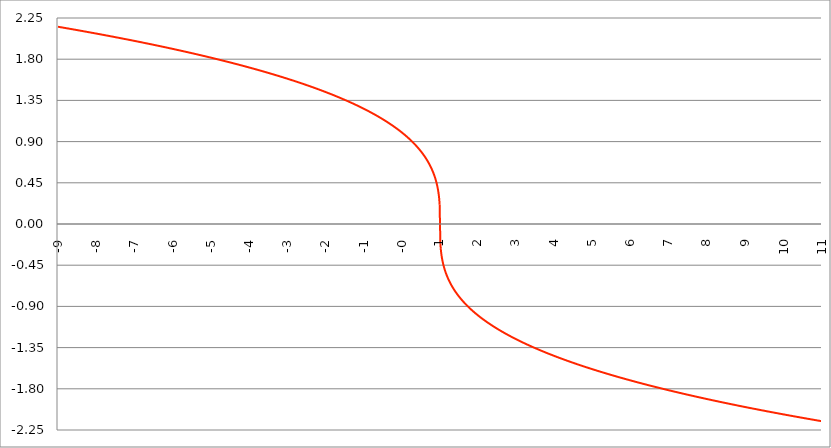
| Category | Series 1 |
|---|---|
| -9.0 | 2.154 |
| -8.99 | 2.154 |
| -8.98 | 2.153 |
| -8.97 | 2.152 |
| -8.96 | 2.152 |
| -8.95 | 2.151 |
| -8.940000000000001 | 2.15 |
| -8.930000000000001 | 2.149 |
| -8.920000000000002 | 2.149 |
| -8.91 | 2.148 |
| -8.900000000000002 | 2.147 |
| -8.890000000000002 | 2.147 |
| -8.880000000000003 | 2.146 |
| -8.870000000000003 | 2.145 |
| -8.860000000000001 | 2.144 |
| -8.850000000000003 | 2.144 |
| -8.840000000000003 | 2.143 |
| -8.830000000000004 | 2.142 |
| -8.820000000000004 | 2.141 |
| -8.810000000000004 | 2.141 |
| -8.800000000000004 | 2.14 |
| -8.790000000000004 | 2.139 |
| -8.780000000000005 | 2.139 |
| -8.770000000000005 | 2.138 |
| -8.760000000000005 | 2.137 |
| -8.750000000000005 | 2.136 |
| -8.740000000000006 | 2.136 |
| -8.730000000000006 | 2.135 |
| -8.720000000000006 | 2.134 |
| -8.710000000000006 | 2.133 |
| -8.700000000000006 | 2.133 |
| -8.690000000000007 | 2.132 |
| -8.680000000000007 | 2.131 |
| -8.670000000000007 | 2.13 |
| -8.660000000000007 | 2.13 |
| -8.650000000000007 | 2.129 |
| -8.640000000000008 | 2.128 |
| -8.630000000000008 | 2.128 |
| -8.620000000000008 | 2.127 |
| -8.610000000000008 | 2.126 |
| -8.600000000000009 | 2.125 |
| -8.590000000000009 | 2.125 |
| -8.580000000000007 | 2.124 |
| -8.57000000000001 | 2.123 |
| -8.56000000000001 | 2.122 |
| -8.55000000000001 | 2.122 |
| -8.54000000000001 | 2.121 |
| -8.53000000000001 | 2.12 |
| -8.52000000000001 | 2.119 |
| -8.51000000000001 | 2.119 |
| -8.50000000000001 | 2.118 |
| -8.49000000000001 | 2.117 |
| -8.48000000000001 | 2.116 |
| -8.47000000000001 | 2.116 |
| -8.46000000000001 | 2.115 |
| -8.45000000000001 | 2.114 |
| -8.44000000000001 | 2.113 |
| -8.430000000000012 | 2.113 |
| -8.420000000000012 | 2.112 |
| -8.410000000000013 | 2.111 |
| -8.400000000000013 | 2.11 |
| -8.390000000000011 | 2.11 |
| -8.380000000000013 | 2.109 |
| -8.370000000000013 | 2.108 |
| -8.360000000000014 | 2.107 |
| -8.350000000000014 | 2.107 |
| -8.340000000000014 | 2.106 |
| -8.330000000000014 | 2.105 |
| -8.320000000000014 | 2.104 |
| -8.310000000000015 | 2.104 |
| -8.300000000000013 | 2.103 |
| -8.290000000000015 | 2.102 |
| -8.280000000000015 | 2.101 |
| -8.270000000000016 | 2.101 |
| -8.260000000000016 | 2.1 |
| -8.250000000000014 | 2.099 |
| -8.240000000000016 | 2.098 |
| -8.230000000000016 | 2.098 |
| -8.220000000000017 | 2.097 |
| -8.210000000000017 | 2.096 |
| -8.200000000000017 | 2.095 |
| -8.190000000000017 | 2.095 |
| -8.180000000000017 | 2.094 |
| -8.170000000000018 | 2.093 |
| -8.160000000000016 | 2.092 |
| -8.150000000000018 | 2.092 |
| -8.140000000000018 | 2.091 |
| -8.130000000000019 | 2.09 |
| -8.120000000000019 | 2.089 |
| -8.110000000000017 | 2.089 |
| -8.10000000000002 | 2.088 |
| -8.09000000000002 | 2.087 |
| -8.08000000000002 | 2.086 |
| -8.07000000000002 | 2.085 |
| -8.06000000000002 | 2.085 |
| -8.05000000000002 | 2.084 |
| -8.04000000000002 | 2.083 |
| -8.03000000000002 | 2.082 |
| -8.020000000000021 | 2.082 |
| -8.010000000000021 | 2.081 |
| -8.000000000000021 | 2.08 |
| -7.990000000000021 | 2.079 |
| -7.980000000000021 | 2.079 |
| -7.970000000000021 | 2.078 |
| -7.960000000000022 | 2.077 |
| -7.950000000000022 | 2.076 |
| -7.940000000000022 | 2.075 |
| -7.930000000000022 | 2.075 |
| -7.920000000000023 | 2.074 |
| -7.910000000000023 | 2.073 |
| -7.900000000000023 | 2.072 |
| -7.890000000000024 | 2.072 |
| -7.880000000000024 | 2.071 |
| -7.870000000000024 | 2.07 |
| -7.860000000000024 | 2.069 |
| -7.850000000000024 | 2.068 |
| -7.840000000000024 | 2.068 |
| -7.830000000000024 | 2.067 |
| -7.820000000000025 | 2.066 |
| -7.810000000000025 | 2.065 |
| -7.800000000000025 | 2.065 |
| -7.790000000000025 | 2.064 |
| -7.780000000000025 | 2.063 |
| -7.770000000000026 | 2.062 |
| -7.760000000000026 | 2.061 |
| -7.750000000000026 | 2.061 |
| -7.740000000000026 | 2.06 |
| -7.730000000000026 | 2.059 |
| -7.720000000000027 | 2.058 |
| -7.710000000000027 | 2.057 |
| -7.700000000000027 | 2.057 |
| -7.690000000000028 | 2.056 |
| -7.680000000000028 | 2.055 |
| -7.670000000000028 | 2.054 |
| -7.660000000000028 | 2.054 |
| -7.650000000000029 | 2.053 |
| -7.640000000000029 | 2.052 |
| -7.63000000000003 | 2.051 |
| -7.620000000000029 | 2.05 |
| -7.61000000000003 | 2.05 |
| -7.60000000000003 | 2.049 |
| -7.59000000000003 | 2.048 |
| -7.58000000000003 | 2.047 |
| -7.57000000000003 | 2.046 |
| -7.560000000000031 | 2.046 |
| -7.550000000000031 | 2.045 |
| -7.540000000000031 | 2.044 |
| -7.530000000000031 | 2.043 |
| -7.520000000000032 | 2.042 |
| -7.510000000000032 | 2.042 |
| -7.500000000000032 | 2.041 |
| -7.490000000000032 | 2.04 |
| -7.480000000000032 | 2.039 |
| -7.470000000000032 | 2.038 |
| -7.460000000000033 | 2.038 |
| -7.450000000000033 | 2.037 |
| -7.440000000000033 | 2.036 |
| -7.430000000000033 | 2.035 |
| -7.420000000000034 | 2.034 |
| -7.410000000000034 | 2.034 |
| -7.400000000000034 | 2.033 |
| -7.390000000000034 | 2.032 |
| -7.380000000000034 | 2.031 |
| -7.370000000000034 | 2.03 |
| -7.360000000000035 | 2.03 |
| -7.350000000000035 | 2.029 |
| -7.340000000000035 | 2.028 |
| -7.330000000000035 | 2.027 |
| -7.320000000000036 | 2.026 |
| -7.310000000000036 | 2.026 |
| -7.300000000000036 | 2.025 |
| -7.290000000000036 | 2.024 |
| -7.280000000000036 | 2.023 |
| -7.270000000000036 | 2.022 |
| -7.260000000000037 | 2.021 |
| -7.250000000000037 | 2.021 |
| -7.240000000000037 | 2.02 |
| -7.230000000000037 | 2.019 |
| -7.220000000000038 | 2.018 |
| -7.210000000000038 | 2.017 |
| -7.200000000000038 | 2.017 |
| -7.190000000000039 | 2.016 |
| -7.180000000000039 | 2.015 |
| -7.170000000000039 | 2.014 |
| -7.160000000000039 | 2.013 |
| -7.150000000000039 | 2.012 |
| -7.14000000000004 | 2.012 |
| -7.13000000000004 | 2.011 |
| -7.12000000000004 | 2.01 |
| -7.11000000000004 | 2.009 |
| -7.10000000000004 | 2.008 |
| -7.090000000000041 | 2.007 |
| -7.080000000000041 | 2.007 |
| -7.070000000000041 | 2.006 |
| -7.060000000000041 | 2.005 |
| -7.050000000000042 | 2.004 |
| -7.040000000000042 | 2.003 |
| -7.030000000000042 | 2.002 |
| -7.020000000000042 | 2.002 |
| -7.010000000000042 | 2.001 |
| -7.000000000000043 | 2 |
| -6.990000000000043 | 1.999 |
| -6.980000000000043 | 1.998 |
| -6.970000000000043 | 1.997 |
| -6.960000000000043 | 1.997 |
| -6.950000000000044 | 1.996 |
| -6.940000000000044 | 1.995 |
| -6.930000000000044 | 1.994 |
| -6.920000000000044 | 1.993 |
| -6.910000000000044 | 1.992 |
| -6.900000000000044 | 1.992 |
| -6.890000000000045 | 1.991 |
| -6.880000000000045 | 1.99 |
| -6.870000000000045 | 1.989 |
| -6.860000000000046 | 1.988 |
| -6.850000000000046 | 1.987 |
| -6.840000000000046 | 1.987 |
| -6.830000000000046 | 1.986 |
| -6.820000000000046 | 1.985 |
| -6.810000000000047 | 1.984 |
| -6.800000000000047 | 1.983 |
| -6.790000000000047 | 1.982 |
| -6.780000000000047 | 1.981 |
| -6.770000000000047 | 1.981 |
| -6.760000000000048 | 1.98 |
| -6.750000000000048 | 1.979 |
| -6.740000000000048 | 1.978 |
| -6.730000000000048 | 1.977 |
| -6.720000000000049 | 1.976 |
| -6.710000000000049 | 1.976 |
| -6.700000000000049 | 1.975 |
| -6.690000000000049 | 1.974 |
| -6.680000000000049 | 1.973 |
| -6.67000000000005 | 1.972 |
| -6.66000000000005 | 1.971 |
| -6.65000000000005 | 1.97 |
| -6.64000000000005 | 1.97 |
| -6.63000000000005 | 1.969 |
| -6.620000000000051 | 1.968 |
| -6.610000000000051 | 1.967 |
| -6.600000000000051 | 1.966 |
| -6.590000000000051 | 1.965 |
| -6.580000000000052 | 1.964 |
| -6.570000000000052 | 1.964 |
| -6.560000000000052 | 1.963 |
| -6.550000000000052 | 1.962 |
| -6.540000000000052 | 1.961 |
| -6.530000000000053 | 1.96 |
| -6.520000000000053 | 1.959 |
| -6.510000000000053 | 1.958 |
| -6.500000000000053 | 1.957 |
| -6.490000000000053 | 1.957 |
| -6.480000000000054 | 1.956 |
| -6.470000000000054 | 1.955 |
| -6.460000000000054 | 1.954 |
| -6.450000000000054 | 1.953 |
| -6.440000000000054 | 1.952 |
| -6.430000000000054 | 1.951 |
| -6.420000000000055 | 1.95 |
| -6.410000000000055 | 1.95 |
| -6.400000000000055 | 1.949 |
| -6.390000000000056 | 1.948 |
| -6.380000000000056 | 1.947 |
| -6.370000000000056 | 1.946 |
| -6.360000000000056 | 1.945 |
| -6.350000000000056 | 1.944 |
| -6.340000000000057 | 1.943 |
| -6.330000000000057 | 1.943 |
| -6.320000000000057 | 1.942 |
| -6.310000000000057 | 1.941 |
| -6.300000000000058 | 1.94 |
| -6.290000000000058 | 1.939 |
| -6.280000000000058 | 1.938 |
| -6.270000000000058 | 1.937 |
| -6.260000000000058 | 1.936 |
| -6.250000000000059 | 1.935 |
| -6.240000000000059 | 1.935 |
| -6.23000000000006 | 1.934 |
| -6.220000000000059 | 1.933 |
| -6.210000000000059 | 1.932 |
| -6.20000000000006 | 1.931 |
| -6.19000000000006 | 1.93 |
| -6.18000000000006 | 1.929 |
| -6.17000000000006 | 1.928 |
| -6.160000000000061 | 1.927 |
| -6.150000000000061 | 1.926 |
| -6.140000000000061 | 1.926 |
| -6.130000000000061 | 1.925 |
| -6.120000000000061 | 1.924 |
| -6.110000000000062 | 1.923 |
| -6.100000000000062 | 1.922 |
| -6.090000000000062 | 1.921 |
| -6.080000000000062 | 1.92 |
| -6.070000000000062 | 1.919 |
| -6.060000000000063 | 1.918 |
| -6.050000000000063 | 1.917 |
| -6.040000000000063 | 1.917 |
| -6.030000000000063 | 1.916 |
| -6.020000000000064 | 1.915 |
| -6.010000000000064 | 1.914 |
| -6.000000000000064 | 1.913 |
| -5.990000000000064 | 1.912 |
| -5.980000000000064 | 1.911 |
| -5.970000000000064 | 1.91 |
| -5.960000000000064 | 1.909 |
| -5.950000000000064 | 1.908 |
| -5.940000000000065 | 1.907 |
| -5.930000000000065 | 1.907 |
| -5.920000000000065 | 1.906 |
| -5.910000000000065 | 1.905 |
| -5.900000000000066 | 1.904 |
| -5.890000000000066 | 1.903 |
| -5.880000000000066 | 1.902 |
| -5.870000000000066 | 1.901 |
| -5.860000000000067 | 1.9 |
| -5.850000000000067 | 1.899 |
| -5.840000000000067 | 1.898 |
| -5.830000000000067 | 1.897 |
| -5.820000000000068 | 1.896 |
| -5.810000000000068 | 1.895 |
| -5.800000000000068 | 1.895 |
| -5.790000000000068 | 1.894 |
| -5.780000000000068 | 1.893 |
| -5.770000000000068 | 1.892 |
| -5.760000000000069 | 1.891 |
| -5.75000000000007 | 1.89 |
| -5.74000000000007 | 1.889 |
| -5.73000000000007 | 1.888 |
| -5.72000000000007 | 1.887 |
| -5.71000000000007 | 1.886 |
| -5.70000000000007 | 1.885 |
| -5.69000000000007 | 1.884 |
| -5.680000000000071 | 1.883 |
| -5.670000000000071 | 1.882 |
| -5.660000000000071 | 1.881 |
| -5.650000000000071 | 1.881 |
| -5.640000000000072 | 1.88 |
| -5.630000000000072 | 1.879 |
| -5.620000000000072 | 1.878 |
| -5.610000000000072 | 1.877 |
| -5.600000000000072 | 1.876 |
| -5.590000000000073 | 1.875 |
| -5.580000000000073 | 1.874 |
| -5.570000000000073 | 1.873 |
| -5.560000000000073 | 1.872 |
| -5.550000000000074 | 1.871 |
| -5.540000000000074 | 1.87 |
| -5.530000000000074 | 1.869 |
| -5.520000000000074 | 1.868 |
| -5.510000000000074 | 1.867 |
| -5.500000000000074 | 1.866 |
| -5.490000000000074 | 1.865 |
| -5.480000000000074 | 1.864 |
| -5.470000000000075 | 1.863 |
| -5.460000000000075 | 1.862 |
| -5.450000000000075 | 1.861 |
| -5.440000000000075 | 1.86 |
| -5.430000000000076 | 1.86 |
| -5.420000000000076 | 1.859 |
| -5.410000000000076 | 1.858 |
| -5.400000000000076 | 1.857 |
| -5.390000000000077 | 1.856 |
| -5.380000000000077 | 1.855 |
| -5.370000000000077 | 1.854 |
| -5.360000000000078 | 1.853 |
| -5.350000000000078 | 1.852 |
| -5.340000000000078 | 1.851 |
| -5.330000000000078 | 1.85 |
| -5.320000000000078 | 1.849 |
| -5.310000000000079 | 1.848 |
| -5.300000000000079 | 1.847 |
| -5.29000000000008 | 1.846 |
| -5.28000000000008 | 1.845 |
| -5.27000000000008 | 1.844 |
| -5.26000000000008 | 1.843 |
| -5.25000000000008 | 1.842 |
| -5.24000000000008 | 1.841 |
| -5.23000000000008 | 1.84 |
| -5.220000000000081 | 1.839 |
| -5.210000000000081 | 1.838 |
| -5.200000000000081 | 1.837 |
| -5.190000000000081 | 1.836 |
| -5.180000000000081 | 1.835 |
| -5.170000000000082 | 1.834 |
| -5.160000000000082 | 1.833 |
| -5.150000000000082 | 1.832 |
| -5.140000000000082 | 1.831 |
| -5.130000000000082 | 1.83 |
| -5.120000000000083 | 1.829 |
| -5.110000000000083 | 1.828 |
| -5.100000000000083 | 1.827 |
| -5.090000000000083 | 1.826 |
| -5.080000000000084 | 1.825 |
| -5.070000000000084 | 1.824 |
| -5.060000000000084 | 1.823 |
| -5.050000000000084 | 1.822 |
| -5.040000000000084 | 1.821 |
| -5.030000000000084 | 1.82 |
| -5.020000000000085 | 1.819 |
| -5.010000000000085 | 1.818 |
| -5.000000000000085 | 1.817 |
| -4.990000000000085 | 1.816 |
| -4.980000000000085 | 1.815 |
| -4.970000000000085 | 1.814 |
| -4.960000000000086 | 1.813 |
| -4.950000000000086 | 1.812 |
| -4.940000000000086 | 1.811 |
| -4.930000000000086 | 1.81 |
| -4.920000000000087 | 1.809 |
| -4.910000000000087 | 1.808 |
| -4.900000000000087 | 1.807 |
| -4.890000000000088 | 1.806 |
| -4.880000000000088 | 1.805 |
| -4.870000000000088 | 1.804 |
| -4.860000000000088 | 1.803 |
| -4.850000000000088 | 1.802 |
| -4.840000000000089 | 1.801 |
| -4.830000000000089 | 1.8 |
| -4.820000000000089 | 1.799 |
| -4.810000000000089 | 1.798 |
| -4.800000000000089 | 1.797 |
| -4.79000000000009 | 1.796 |
| -4.78000000000009 | 1.795 |
| -4.77000000000009 | 1.794 |
| -4.76000000000009 | 1.793 |
| -4.750000000000091 | 1.792 |
| -4.740000000000091 | 1.79 |
| -4.730000000000091 | 1.789 |
| -4.720000000000091 | 1.788 |
| -4.710000000000091 | 1.787 |
| -4.700000000000092 | 1.786 |
| -4.690000000000092 | 1.785 |
| -4.680000000000092 | 1.784 |
| -4.670000000000092 | 1.783 |
| -4.660000000000092 | 1.782 |
| -4.650000000000093 | 1.781 |
| -4.640000000000093 | 1.78 |
| -4.630000000000093 | 1.779 |
| -4.620000000000093 | 1.778 |
| -4.610000000000093 | 1.777 |
| -4.600000000000094 | 1.776 |
| -4.590000000000094 | 1.775 |
| -4.580000000000094 | 1.774 |
| -4.570000000000094 | 1.773 |
| -4.560000000000095 | 1.772 |
| -4.550000000000095 | 1.771 |
| -4.540000000000095 | 1.769 |
| -4.530000000000095 | 1.768 |
| -4.520000000000095 | 1.767 |
| -4.510000000000096 | 1.766 |
| -4.500000000000096 | 1.765 |
| -4.490000000000096 | 1.764 |
| -4.480000000000096 | 1.763 |
| -4.470000000000096 | 1.762 |
| -4.460000000000097 | 1.761 |
| -4.450000000000097 | 1.76 |
| -4.440000000000097 | 1.759 |
| -4.430000000000097 | 1.758 |
| -4.420000000000098 | 1.757 |
| -4.410000000000098 | 1.755 |
| -4.400000000000098 | 1.754 |
| -4.390000000000098 | 1.753 |
| -4.380000000000098 | 1.752 |
| -4.370000000000099 | 1.751 |
| -4.360000000000099 | 1.75 |
| -4.350000000000099 | 1.749 |
| -4.340000000000099 | 1.748 |
| -4.330000000000099 | 1.747 |
| -4.3200000000001 | 1.746 |
| -4.3100000000001 | 1.745 |
| -4.3000000000001 | 1.744 |
| -4.2900000000001 | 1.742 |
| -4.2800000000001 | 1.741 |
| -4.2700000000001 | 1.74 |
| -4.260000000000101 | 1.739 |
| -4.250000000000101 | 1.738 |
| -4.240000000000101 | 1.737 |
| -4.230000000000101 | 1.736 |
| -4.220000000000102 | 1.735 |
| -4.210000000000102 | 1.734 |
| -4.200000000000102 | 1.732 |
| -4.190000000000103 | 1.731 |
| -4.180000000000103 | 1.73 |
| -4.170000000000103 | 1.729 |
| -4.160000000000103 | 1.728 |
| -4.150000000000103 | 1.727 |
| -4.140000000000104 | 1.726 |
| -4.130000000000104 | 1.725 |
| -4.120000000000104 | 1.724 |
| -4.110000000000104 | 1.722 |
| -4.100000000000104 | 1.721 |
| -4.090000000000104 | 1.72 |
| -4.080000000000104 | 1.719 |
| -4.070000000000105 | 1.718 |
| -4.060000000000105 | 1.717 |
| -4.050000000000105 | 1.716 |
| -4.040000000000105 | 1.715 |
| -4.030000000000105 | 1.713 |
| -4.020000000000106 | 1.712 |
| -4.010000000000106 | 1.711 |
| -4.000000000000106 | 1.71 |
| -3.990000000000107 | 1.709 |
| -3.980000000000107 | 1.708 |
| -3.970000000000107 | 1.707 |
| -3.960000000000107 | 1.705 |
| -3.950000000000108 | 1.704 |
| -3.940000000000108 | 1.703 |
| -3.930000000000108 | 1.702 |
| -3.920000000000108 | 1.701 |
| -3.910000000000108 | 1.7 |
| -3.900000000000109 | 1.698 |
| -3.890000000000109 | 1.697 |
| -3.880000000000109 | 1.696 |
| -3.870000000000109 | 1.695 |
| -3.86000000000011 | 1.694 |
| -3.85000000000011 | 1.693 |
| -3.84000000000011 | 1.692 |
| -3.83000000000011 | 1.69 |
| -3.82000000000011 | 1.689 |
| -3.810000000000111 | 1.688 |
| -3.800000000000111 | 1.687 |
| -3.790000000000111 | 1.686 |
| -3.780000000000111 | 1.685 |
| -3.770000000000111 | 1.683 |
| -3.760000000000112 | 1.682 |
| -3.750000000000112 | 1.681 |
| -3.740000000000112 | 1.68 |
| -3.730000000000112 | 1.679 |
| -3.720000000000112 | 1.677 |
| -3.710000000000113 | 1.676 |
| -3.700000000000113 | 1.675 |
| -3.690000000000113 | 1.674 |
| -3.680000000000113 | 1.673 |
| -3.670000000000114 | 1.671 |
| -3.660000000000114 | 1.67 |
| -3.650000000000114 | 1.669 |
| -3.640000000000114 | 1.668 |
| -3.630000000000114 | 1.667 |
| -3.620000000000115 | 1.666 |
| -3.610000000000115 | 1.664 |
| -3.600000000000115 | 1.663 |
| -3.590000000000115 | 1.662 |
| -3.580000000000116 | 1.661 |
| -3.570000000000116 | 1.659 |
| -3.560000000000116 | 1.658 |
| -3.550000000000116 | 1.657 |
| -3.540000000000116 | 1.656 |
| -3.530000000000117 | 1.655 |
| -3.520000000000117 | 1.653 |
| -3.510000000000117 | 1.652 |
| -3.500000000000117 | 1.651 |
| -3.490000000000117 | 1.65 |
| -3.480000000000118 | 1.649 |
| -3.470000000000118 | 1.647 |
| -3.460000000000118 | 1.646 |
| -3.450000000000118 | 1.645 |
| -3.440000000000118 | 1.644 |
| -3.430000000000119 | 1.642 |
| -3.420000000000119 | 1.641 |
| -3.410000000000119 | 1.64 |
| -3.400000000000119 | 1.639 |
| -3.39000000000012 | 1.637 |
| -3.38000000000012 | 1.636 |
| -3.37000000000012 | 1.635 |
| -3.36000000000012 | 1.634 |
| -3.35000000000012 | 1.632 |
| -3.340000000000121 | 1.631 |
| -3.330000000000121 | 1.63 |
| -3.320000000000121 | 1.629 |
| -3.310000000000121 | 1.627 |
| -3.300000000000121 | 1.626 |
| -3.290000000000122 | 1.625 |
| -3.280000000000122 | 1.624 |
| -3.270000000000122 | 1.622 |
| -3.260000000000122 | 1.621 |
| -3.250000000000123 | 1.62 |
| -3.240000000000123 | 1.619 |
| -3.230000000000123 | 1.617 |
| -3.220000000000123 | 1.616 |
| -3.210000000000123 | 1.615 |
| -3.200000000000124 | 1.613 |
| -3.190000000000124 | 1.612 |
| -3.180000000000124 | 1.611 |
| -3.170000000000124 | 1.61 |
| -3.160000000000124 | 1.608 |
| -3.150000000000125 | 1.607 |
| -3.140000000000125 | 1.606 |
| -3.130000000000125 | 1.604 |
| -3.120000000000125 | 1.603 |
| -3.110000000000126 | 1.602 |
| -3.100000000000126 | 1.601 |
| -3.090000000000126 | 1.599 |
| -3.080000000000126 | 1.598 |
| -3.070000000000126 | 1.597 |
| -3.060000000000127 | 1.595 |
| -3.050000000000127 | 1.594 |
| -3.040000000000127 | 1.593 |
| -3.030000000000127 | 1.591 |
| -3.020000000000127 | 1.59 |
| -3.010000000000128 | 1.589 |
| -3.000000000000128 | 1.587 |
| -2.990000000000128 | 1.586 |
| -2.980000000000128 | 1.585 |
| -2.970000000000129 | 1.583 |
| -2.960000000000129 | 1.582 |
| -2.950000000000129 | 1.581 |
| -2.940000000000129 | 1.579 |
| -2.930000000000129 | 1.578 |
| -2.92000000000013 | 1.577 |
| -2.91000000000013 | 1.575 |
| -2.90000000000013 | 1.574 |
| -2.89000000000013 | 1.573 |
| -2.88000000000013 | 1.571 |
| -2.870000000000131 | 1.57 |
| -2.860000000000131 | 1.569 |
| -2.850000000000131 | 1.567 |
| -2.840000000000131 | 1.566 |
| -2.830000000000131 | 1.565 |
| -2.820000000000132 | 1.563 |
| -2.810000000000132 | 1.562 |
| -2.800000000000132 | 1.56 |
| -2.790000000000132 | 1.559 |
| -2.780000000000132 | 1.558 |
| -2.770000000000133 | 1.556 |
| -2.760000000000133 | 1.555 |
| -2.750000000000133 | 1.554 |
| -2.740000000000133 | 1.552 |
| -2.730000000000134 | 1.551 |
| -2.720000000000134 | 1.549 |
| -2.710000000000134 | 1.548 |
| -2.700000000000134 | 1.547 |
| -2.690000000000134 | 1.545 |
| -2.680000000000135 | 1.544 |
| -2.670000000000135 | 1.542 |
| -2.660000000000135 | 1.541 |
| -2.650000000000135 | 1.54 |
| -2.640000000000135 | 1.538 |
| -2.630000000000136 | 1.537 |
| -2.620000000000136 | 1.535 |
| -2.610000000000136 | 1.534 |
| -2.600000000000136 | 1.533 |
| -2.590000000000137 | 1.531 |
| -2.580000000000137 | 1.53 |
| -2.570000000000137 | 1.528 |
| -2.560000000000137 | 1.527 |
| -2.550000000000137 | 1.525 |
| -2.540000000000138 | 1.524 |
| -2.530000000000138 | 1.523 |
| -2.520000000000138 | 1.521 |
| -2.510000000000138 | 1.52 |
| -2.500000000000139 | 1.518 |
| -2.490000000000139 | 1.517 |
| -2.480000000000139 | 1.515 |
| -2.470000000000139 | 1.514 |
| -2.460000000000139 | 1.512 |
| -2.45000000000014 | 1.511 |
| -2.44000000000014 | 1.51 |
| -2.43000000000014 | 1.508 |
| -2.42000000000014 | 1.507 |
| -2.41000000000014 | 1.505 |
| -2.400000000000141 | 1.504 |
| -2.390000000000141 | 1.502 |
| -2.380000000000141 | 1.501 |
| -2.370000000000141 | 1.499 |
| -2.360000000000141 | 1.498 |
| -2.350000000000142 | 1.496 |
| -2.340000000000142 | 1.495 |
| -2.330000000000142 | 1.493 |
| -2.320000000000142 | 1.492 |
| -2.310000000000143 | 1.49 |
| -2.300000000000143 | 1.489 |
| -2.290000000000143 | 1.487 |
| -2.280000000000143 | 1.486 |
| -2.270000000000143 | 1.484 |
| -2.260000000000144 | 1.483 |
| -2.250000000000144 | 1.481 |
| -2.240000000000144 | 1.48 |
| -2.230000000000144 | 1.478 |
| -2.220000000000145 | 1.477 |
| -2.210000000000145 | 1.475 |
| -2.200000000000145 | 1.474 |
| -2.190000000000145 | 1.472 |
| -2.180000000000145 | 1.471 |
| -2.170000000000146 | 1.469 |
| -2.160000000000146 | 1.467 |
| -2.150000000000146 | 1.466 |
| -2.140000000000146 | 1.464 |
| -2.130000000000146 | 1.463 |
| -2.120000000000147 | 1.461 |
| -2.110000000000147 | 1.46 |
| -2.100000000000147 | 1.458 |
| -2.090000000000147 | 1.457 |
| -2.080000000000147 | 1.455 |
| -2.070000000000148 | 1.453 |
| -2.060000000000148 | 1.452 |
| -2.050000000000148 | 1.45 |
| -2.040000000000148 | 1.449 |
| -2.030000000000149 | 1.447 |
| -2.020000000000149 | 1.445 |
| -2.010000000000149 | 1.444 |
| -2.000000000000149 | 1.442 |
| -1.990000000000149 | 1.441 |
| -1.980000000000149 | 1.439 |
| -1.970000000000149 | 1.437 |
| -1.960000000000149 | 1.436 |
| -1.950000000000149 | 1.434 |
| -1.940000000000149 | 1.433 |
| -1.930000000000149 | 1.431 |
| -1.920000000000149 | 1.429 |
| -1.910000000000149 | 1.428 |
| -1.900000000000149 | 1.426 |
| -1.89000000000015 | 1.424 |
| -1.88000000000015 | 1.423 |
| -1.87000000000015 | 1.421 |
| -1.86000000000015 | 1.419 |
| -1.85000000000015 | 1.418 |
| -1.84000000000015 | 1.416 |
| -1.83000000000015 | 1.414 |
| -1.82000000000015 | 1.413 |
| -1.810000000000149 | 1.411 |
| -1.800000000000149 | 1.409 |
| -1.790000000000149 | 1.408 |
| -1.780000000000149 | 1.406 |
| -1.770000000000149 | 1.404 |
| -1.760000000000149 | 1.403 |
| -1.750000000000149 | 1.401 |
| -1.740000000000149 | 1.399 |
| -1.730000000000149 | 1.398 |
| -1.720000000000149 | 1.396 |
| -1.710000000000149 | 1.394 |
| -1.700000000000149 | 1.392 |
| -1.690000000000149 | 1.391 |
| -1.680000000000149 | 1.389 |
| -1.670000000000149 | 1.387 |
| -1.660000000000149 | 1.386 |
| -1.650000000000149 | 1.384 |
| -1.640000000000149 | 1.382 |
| -1.630000000000149 | 1.38 |
| -1.620000000000149 | 1.379 |
| -1.610000000000149 | 1.377 |
| -1.600000000000149 | 1.375 |
| -1.590000000000149 | 1.373 |
| -1.580000000000149 | 1.372 |
| -1.570000000000149 | 1.37 |
| -1.560000000000149 | 1.368 |
| -1.550000000000149 | 1.366 |
| -1.540000000000149 | 1.364 |
| -1.530000000000149 | 1.363 |
| -1.520000000000149 | 1.361 |
| -1.510000000000149 | 1.359 |
| -1.500000000000149 | 1.357 |
| -1.490000000000149 | 1.355 |
| -1.480000000000149 | 1.354 |
| -1.470000000000149 | 1.352 |
| -1.460000000000149 | 1.35 |
| -1.450000000000149 | 1.348 |
| -1.440000000000149 | 1.346 |
| -1.430000000000149 | 1.344 |
| -1.420000000000149 | 1.343 |
| -1.410000000000149 | 1.341 |
| -1.400000000000149 | 1.339 |
| -1.390000000000149 | 1.337 |
| -1.380000000000149 | 1.335 |
| -1.370000000000149 | 1.333 |
| -1.360000000000149 | 1.331 |
| -1.350000000000149 | 1.33 |
| -1.340000000000149 | 1.328 |
| -1.330000000000149 | 1.326 |
| -1.320000000000149 | 1.324 |
| -1.310000000000149 | 1.322 |
| -1.300000000000149 | 1.32 |
| -1.290000000000149 | 1.318 |
| -1.280000000000149 | 1.316 |
| -1.270000000000149 | 1.314 |
| -1.260000000000149 | 1.312 |
| -1.250000000000149 | 1.31 |
| -1.240000000000149 | 1.308 |
| -1.230000000000149 | 1.306 |
| -1.220000000000149 | 1.305 |
| -1.210000000000148 | 1.303 |
| -1.200000000000148 | 1.301 |
| -1.190000000000148 | 1.299 |
| -1.180000000000148 | 1.297 |
| -1.170000000000148 | 1.295 |
| -1.160000000000148 | 1.293 |
| -1.150000000000148 | 1.291 |
| -1.140000000000148 | 1.289 |
| -1.130000000000148 | 1.287 |
| -1.120000000000148 | 1.285 |
| -1.110000000000148 | 1.283 |
| -1.100000000000148 | 1.281 |
| -1.090000000000148 | 1.279 |
| -1.080000000000148 | 1.277 |
| -1.070000000000148 | 1.274 |
| -1.060000000000148 | 1.272 |
| -1.050000000000148 | 1.27 |
| -1.040000000000148 | 1.268 |
| -1.030000000000148 | 1.266 |
| -1.020000000000148 | 1.264 |
| -1.010000000000148 | 1.262 |
| -1.000000000000148 | 1.26 |
| -0.990000000000148 | 1.258 |
| -0.980000000000148 | 1.256 |
| -0.970000000000148 | 1.254 |
| -0.960000000000148 | 1.251 |
| -0.950000000000148 | 1.249 |
| -0.940000000000148 | 1.247 |
| -0.930000000000148 | 1.245 |
| -0.920000000000148 | 1.243 |
| -0.910000000000148 | 1.241 |
| -0.900000000000148 | 1.239 |
| -0.890000000000148 | 1.236 |
| -0.880000000000148 | 1.234 |
| -0.870000000000148 | 1.232 |
| -0.860000000000148 | 1.23 |
| -0.850000000000148 | 1.228 |
| -0.840000000000148 | 1.225 |
| -0.830000000000148 | 1.223 |
| -0.820000000000148 | 1.221 |
| -0.810000000000148 | 1.219 |
| -0.800000000000148 | 1.216 |
| -0.790000000000148 | 1.214 |
| -0.780000000000148 | 1.212 |
| -0.770000000000148 | 1.21 |
| -0.760000000000148 | 1.207 |
| -0.750000000000148 | 1.205 |
| -0.740000000000148 | 1.203 |
| -0.730000000000148 | 1.2 |
| -0.720000000000148 | 1.198 |
| -0.710000000000148 | 1.196 |
| -0.700000000000148 | 1.193 |
| -0.690000000000148 | 1.191 |
| -0.680000000000148 | 1.189 |
| -0.670000000000148 | 1.186 |
| -0.660000000000148 | 1.184 |
| -0.650000000000148 | 1.182 |
| -0.640000000000148 | 1.179 |
| -0.630000000000148 | 1.177 |
| -0.620000000000148 | 1.174 |
| -0.610000000000148 | 1.172 |
| -0.600000000000148 | 1.17 |
| -0.590000000000148 | 1.167 |
| -0.580000000000148 | 1.165 |
| -0.570000000000148 | 1.162 |
| -0.560000000000148 | 1.16 |
| -0.550000000000148 | 1.157 |
| -0.540000000000148 | 1.155 |
| -0.530000000000148 | 1.152 |
| -0.520000000000148 | 1.15 |
| -0.510000000000148 | 1.147 |
| -0.500000000000148 | 1.145 |
| -0.490000000000148 | 1.142 |
| -0.480000000000148 | 1.14 |
| -0.470000000000148 | 1.137 |
| -0.460000000000148 | 1.134 |
| -0.450000000000148 | 1.132 |
| -0.440000000000148 | 1.129 |
| -0.430000000000148 | 1.127 |
| -0.420000000000148 | 1.124 |
| -0.410000000000148 | 1.121 |
| -0.400000000000148 | 1.119 |
| -0.390000000000148 | 1.116 |
| -0.380000000000148 | 1.113 |
| -0.370000000000148 | 1.111 |
| -0.360000000000148 | 1.108 |
| -0.350000000000148 | 1.105 |
| -0.340000000000148 | 1.102 |
| -0.330000000000148 | 1.1 |
| -0.320000000000148 | 1.097 |
| -0.310000000000148 | 1.094 |
| -0.300000000000148 | 1.091 |
| -0.290000000000148 | 1.089 |
| -0.280000000000148 | 1.086 |
| -0.270000000000148 | 1.083 |
| -0.260000000000148 | 1.08 |
| -0.250000000000148 | 1.077 |
| -0.240000000000148 | 1.074 |
| -0.230000000000148 | 1.071 |
| -0.220000000000148 | 1.069 |
| -0.210000000000148 | 1.066 |
| -0.200000000000148 | 1.063 |
| -0.190000000000148 | 1.06 |
| -0.180000000000148 | 1.057 |
| -0.170000000000148 | 1.054 |
| -0.160000000000148 | 1.051 |
| -0.150000000000148 | 1.048 |
| -0.140000000000148 | 1.045 |
| -0.130000000000148 | 1.042 |
| -0.120000000000148 | 1.038 |
| -0.110000000000148 | 1.035 |
| -0.100000000000148 | 1.032 |
| -0.0900000000001475 | 1.029 |
| -0.0800000000001476 | 1.026 |
| -0.0700000000001476 | 1.023 |
| -0.0600000000001476 | 1.02 |
| -0.0500000000001476 | 1.016 |
| -0.0400000000001476 | 1.013 |
| -0.0300000000001476 | 1.01 |
| -0.0200000000001476 | 1.007 |
| -0.0100000000001476 | 1.003 |
| -1.47572926101347e-13 | 1 |
| 0.00999999999985242 | 0.997 |
| 0.0199999999998524 | 0.993 |
| 0.0299999999998524 | 0.99 |
| 0.0399999999998524 | 0.986 |
| 0.0499999999998524 | 0.983 |
| 0.0599999999998524 | 0.98 |
| 0.0699999999998524 | 0.976 |
| 0.0799999999998524 | 0.973 |
| 0.0899999999998524 | 0.969 |
| 0.0999999999998524 | 0.965 |
| 0.109999999999852 | 0.962 |
| 0.119999999999852 | 0.958 |
| 0.129999999999852 | 0.955 |
| 0.139999999999852 | 0.951 |
| 0.149999999999852 | 0.947 |
| 0.159999999999852 | 0.944 |
| 0.169999999999852 | 0.94 |
| 0.179999999999852 | 0.936 |
| 0.189999999999852 | 0.932 |
| 0.199999999999852 | 0.928 |
| 0.209999999999852 | 0.924 |
| 0.219999999999852 | 0.921 |
| 0.229999999999852 | 0.917 |
| 0.239999999999852 | 0.913 |
| 0.249999999999852 | 0.909 |
| 0.259999999999852 | 0.905 |
| 0.269999999999852 | 0.9 |
| 0.279999999999853 | 0.896 |
| 0.289999999999853 | 0.892 |
| 0.299999999999853 | 0.888 |
| 0.309999999999853 | 0.884 |
| 0.319999999999853 | 0.879 |
| 0.329999999999853 | 0.875 |
| 0.339999999999853 | 0.871 |
| 0.349999999999853 | 0.866 |
| 0.359999999999853 | 0.862 |
| 0.369999999999853 | 0.857 |
| 0.379999999999853 | 0.853 |
| 0.389999999999853 | 0.848 |
| 0.399999999999853 | 0.843 |
| 0.409999999999853 | 0.839 |
| 0.419999999999853 | 0.834 |
| 0.429999999999853 | 0.829 |
| 0.439999999999853 | 0.824 |
| 0.449999999999853 | 0.819 |
| 0.459999999999853 | 0.814 |
| 0.469999999999853 | 0.809 |
| 0.479999999999853 | 0.804 |
| 0.489999999999853 | 0.799 |
| 0.499999999999853 | 0.794 |
| 0.509999999999853 | 0.788 |
| 0.519999999999853 | 0.783 |
| 0.529999999999853 | 0.777 |
| 0.539999999999853 | 0.772 |
| 0.549999999999853 | 0.766 |
| 0.559999999999853 | 0.761 |
| 0.569999999999853 | 0.755 |
| 0.579999999999853 | 0.749 |
| 0.589999999999853 | 0.743 |
| 0.599999999999853 | 0.737 |
| 0.609999999999853 | 0.731 |
| 0.619999999999853 | 0.724 |
| 0.629999999999853 | 0.718 |
| 0.639999999999853 | 0.711 |
| 0.649999999999853 | 0.705 |
| 0.659999999999853 | 0.698 |
| 0.669999999999853 | 0.691 |
| 0.679999999999853 | 0.684 |
| 0.689999999999853 | 0.677 |
| 0.699999999999853 | 0.669 |
| 0.709999999999853 | 0.662 |
| 0.719999999999853 | 0.654 |
| 0.729999999999853 | 0.646 |
| 0.739999999999853 | 0.638 |
| 0.749999999999853 | 0.63 |
| 0.759999999999853 | 0.621 |
| 0.769999999999853 | 0.613 |
| 0.779999999999853 | 0.604 |
| 0.789999999999853 | 0.594 |
| 0.799999999999853 | 0.585 |
| 0.809999999999853 | 0.575 |
| 0.819999999999853 | 0.565 |
| 0.829999999999853 | 0.554 |
| 0.839999999999853 | 0.543 |
| 0.849999999999853 | 0.531 |
| 0.859999999999853 | 0.519 |
| 0.869999999999853 | 0.507 |
| 0.879999999999853 | 0.493 |
| 0.889999999999853 | 0.479 |
| 0.899999999999853 | 0.464 |
| 0.909999999999853 | 0.448 |
| 0.919999999999853 | 0.431 |
| 0.929999999999853 | 0.412 |
| 0.939999999999853 | 0.391 |
| 0.949999999999853 | 0.368 |
| 0.959999999999853 | 0.342 |
| 0.969999999999853 | 0.311 |
| 0.979999999999853 | 0.271 |
| 0.989999999999853 | 0.215 |
| 0.999999999999853 | 0 |
| 1.009999999999853 | -0.215 |
| 1.019999999999853 | -0.271 |
| 1.029999999999853 | -0.311 |
| 1.039999999999853 | -0.342 |
| 1.049999999999853 | -0.368 |
| 1.059999999999853 | -0.391 |
| 1.069999999999853 | -0.412 |
| 1.079999999999853 | -0.431 |
| 1.089999999999853 | -0.448 |
| 1.099999999999853 | -0.464 |
| 1.109999999999853 | -0.479 |
| 1.119999999999853 | -0.493 |
| 1.129999999999853 | -0.507 |
| 1.139999999999853 | -0.519 |
| 1.149999999999853 | -0.531 |
| 1.159999999999853 | -0.543 |
| 1.169999999999853 | -0.554 |
| 1.179999999999853 | -0.565 |
| 1.189999999999853 | -0.575 |
| 1.199999999999853 | -0.585 |
| 1.209999999999853 | -0.594 |
| 1.219999999999853 | -0.604 |
| 1.229999999999853 | -0.613 |
| 1.239999999999853 | -0.621 |
| 1.249999999999853 | -0.63 |
| 1.259999999999853 | -0.638 |
| 1.269999999999853 | -0.646 |
| 1.279999999999853 | -0.654 |
| 1.289999999999853 | -0.662 |
| 1.299999999999853 | -0.669 |
| 1.309999999999853 | -0.677 |
| 1.319999999999853 | -0.684 |
| 1.329999999999853 | -0.691 |
| 1.339999999999853 | -0.698 |
| 1.349999999999853 | -0.705 |
| 1.359999999999853 | -0.711 |
| 1.369999999999853 | -0.718 |
| 1.379999999999853 | -0.724 |
| 1.389999999999853 | -0.731 |
| 1.399999999999853 | -0.737 |
| 1.409999999999853 | -0.743 |
| 1.419999999999853 | -0.749 |
| 1.429999999999853 | -0.755 |
| 1.439999999999853 | -0.761 |
| 1.449999999999853 | -0.766 |
| 1.459999999999853 | -0.772 |
| 1.469999999999853 | -0.777 |
| 1.479999999999853 | -0.783 |
| 1.489999999999853 | -0.788 |
| 1.499999999999853 | -0.794 |
| 1.509999999999853 | -0.799 |
| 1.519999999999853 | -0.804 |
| 1.529999999999853 | -0.809 |
| 1.539999999999853 | -0.814 |
| 1.549999999999853 | -0.819 |
| 1.559999999999853 | -0.824 |
| 1.569999999999853 | -0.829 |
| 1.579999999999854 | -0.834 |
| 1.589999999999854 | -0.839 |
| 1.599999999999854 | -0.843 |
| 1.609999999999853 | -0.848 |
| 1.619999999999853 | -0.853 |
| 1.629999999999853 | -0.857 |
| 1.639999999999853 | -0.862 |
| 1.649999999999853 | -0.866 |
| 1.659999999999853 | -0.871 |
| 1.669999999999853 | -0.875 |
| 1.679999999999854 | -0.879 |
| 1.689999999999854 | -0.884 |
| 1.699999999999854 | -0.888 |
| 1.709999999999854 | -0.892 |
| 1.719999999999854 | -0.896 |
| 1.729999999999854 | -0.9 |
| 1.739999999999854 | -0.905 |
| 1.749999999999854 | -0.909 |
| 1.759999999999854 | -0.913 |
| 1.769999999999854 | -0.917 |
| 1.779999999999854 | -0.921 |
| 1.789999999999854 | -0.924 |
| 1.799999999999854 | -0.928 |
| 1.809999999999854 | -0.932 |
| 1.819999999999854 | -0.936 |
| 1.829999999999854 | -0.94 |
| 1.839999999999854 | -0.944 |
| 1.849999999999854 | -0.947 |
| 1.859999999999854 | -0.951 |
| 1.869999999999854 | -0.955 |
| 1.879999999999854 | -0.958 |
| 1.889999999999854 | -0.962 |
| 1.899999999999854 | -0.965 |
| 1.909999999999854 | -0.969 |
| 1.919999999999854 | -0.973 |
| 1.929999999999854 | -0.976 |
| 1.939999999999854 | -0.98 |
| 1.949999999999854 | -0.983 |
| 1.959999999999854 | -0.986 |
| 1.969999999999854 | -0.99 |
| 1.979999999999854 | -0.993 |
| 1.989999999999854 | -0.997 |
| 1.999999999999854 | -1 |
| 2.009999999999854 | -1.003 |
| 2.019999999999853 | -1.007 |
| 2.029999999999853 | -1.01 |
| 2.039999999999853 | -1.013 |
| 2.049999999999853 | -1.016 |
| 2.059999999999853 | -1.02 |
| 2.069999999999852 | -1.023 |
| 2.079999999999852 | -1.026 |
| 2.089999999999852 | -1.029 |
| 2.099999999999852 | -1.032 |
| 2.109999999999852 | -1.035 |
| 2.119999999999851 | -1.038 |
| 2.129999999999851 | -1.042 |
| 2.139999999999851 | -1.045 |
| 2.149999999999851 | -1.048 |
| 2.15999999999985 | -1.051 |
| 2.16999999999985 | -1.054 |
| 2.17999999999985 | -1.057 |
| 2.18999999999985 | -1.06 |
| 2.19999999999985 | -1.063 |
| 2.209999999999849 | -1.066 |
| 2.219999999999849 | -1.069 |
| 2.229999999999849 | -1.071 |
| 2.239999999999849 | -1.074 |
| 2.249999999999849 | -1.077 |
| 2.259999999999848 | -1.08 |
| 2.269999999999848 | -1.083 |
| 2.279999999999848 | -1.086 |
| 2.289999999999848 | -1.089 |
| 2.299999999999847 | -1.091 |
| 2.309999999999847 | -1.094 |
| 2.319999999999847 | -1.097 |
| 2.329999999999847 | -1.1 |
| 2.339999999999847 | -1.102 |
| 2.349999999999846 | -1.105 |
| 2.359999999999846 | -1.108 |
| 2.369999999999846 | -1.111 |
| 2.379999999999846 | -1.113 |
| 2.389999999999846 | -1.116 |
| 2.399999999999845 | -1.119 |
| 2.409999999999845 | -1.121 |
| 2.419999999999845 | -1.124 |
| 2.429999999999845 | -1.127 |
| 2.439999999999844 | -1.129 |
| 2.449999999999844 | -1.132 |
| 2.459999999999844 | -1.134 |
| 2.469999999999844 | -1.137 |
| 2.479999999999844 | -1.14 |
| 2.489999999999843 | -1.142 |
| 2.499999999999843 | -1.145 |
| 2.509999999999843 | -1.147 |
| 2.519999999999843 | -1.15 |
| 2.529999999999843 | -1.152 |
| 2.539999999999842 | -1.155 |
| 2.549999999999842 | -1.157 |
| 2.559999999999842 | -1.16 |
| 2.569999999999842 | -1.162 |
| 2.579999999999842 | -1.165 |
| 2.589999999999841 | -1.167 |
| 2.599999999999841 | -1.17 |
| 2.609999999999841 | -1.172 |
| 2.619999999999841 | -1.174 |
| 2.62999999999984 | -1.177 |
| 2.63999999999984 | -1.179 |
| 2.64999999999984 | -1.182 |
| 2.65999999999984 | -1.184 |
| 2.66999999999984 | -1.186 |
| 2.679999999999839 | -1.189 |
| 2.689999999999839 | -1.191 |
| 2.699999999999839 | -1.193 |
| 2.709999999999839 | -1.196 |
| 2.719999999999838 | -1.198 |
| 2.729999999999838 | -1.2 |
| 2.739999999999838 | -1.203 |
| 2.749999999999838 | -1.205 |
| 2.759999999999838 | -1.207 |
| 2.769999999999837 | -1.21 |
| 2.779999999999837 | -1.212 |
| 2.789999999999837 | -1.214 |
| 2.799999999999837 | -1.216 |
| 2.809999999999837 | -1.219 |
| 2.819999999999836 | -1.221 |
| 2.829999999999836 | -1.223 |
| 2.839999999999836 | -1.225 |
| 2.849999999999836 | -1.228 |
| 2.859999999999836 | -1.23 |
| 2.869999999999835 | -1.232 |
| 2.879999999999835 | -1.234 |
| 2.889999999999835 | -1.236 |
| 2.899999999999835 | -1.239 |
| 2.909999999999834 | -1.241 |
| 2.919999999999834 | -1.243 |
| 2.929999999999834 | -1.245 |
| 2.939999999999834 | -1.247 |
| 2.949999999999834 | -1.249 |
| 2.959999999999833 | -1.251 |
| 2.969999999999833 | -1.254 |
| 2.979999999999833 | -1.256 |
| 2.989999999999833 | -1.258 |
| 2.999999999999833 | -1.26 |
| 3.009999999999832 | -1.262 |
| 3.019999999999832 | -1.264 |
| 3.029999999999832 | -1.266 |
| 3.039999999999832 | -1.268 |
| 3.049999999999832 | -1.27 |
| 3.059999999999831 | -1.272 |
| 3.069999999999831 | -1.274 |
| 3.079999999999831 | -1.277 |
| 3.089999999999831 | -1.279 |
| 3.09999999999983 | -1.281 |
| 3.10999999999983 | -1.283 |
| 3.11999999999983 | -1.285 |
| 3.12999999999983 | -1.287 |
| 3.13999999999983 | -1.289 |
| 3.149999999999829 | -1.291 |
| 3.159999999999829 | -1.293 |
| 3.169999999999829 | -1.295 |
| 3.179999999999829 | -1.297 |
| 3.189999999999829 | -1.299 |
| 3.199999999999828 | -1.301 |
| 3.209999999999828 | -1.303 |
| 3.219999999999828 | -1.305 |
| 3.229999999999828 | -1.306 |
| 3.239999999999827 | -1.308 |
| 3.249999999999827 | -1.31 |
| 3.259999999999827 | -1.312 |
| 3.269999999999827 | -1.314 |
| 3.279999999999827 | -1.316 |
| 3.289999999999826 | -1.318 |
| 3.299999999999826 | -1.32 |
| 3.309999999999826 | -1.322 |
| 3.319999999999826 | -1.324 |
| 3.329999999999825 | -1.326 |
| 3.339999999999825 | -1.328 |
| 3.349999999999825 | -1.33 |
| 3.359999999999825 | -1.331 |
| 3.369999999999825 | -1.333 |
| 3.379999999999824 | -1.335 |
| 3.389999999999824 | -1.337 |
| 3.399999999999824 | -1.339 |
| 3.409999999999824 | -1.341 |
| 3.419999999999824 | -1.343 |
| 3.429999999999823 | -1.344 |
| 3.439999999999823 | -1.346 |
| 3.449999999999823 | -1.348 |
| 3.459999999999823 | -1.35 |
| 3.469999999999823 | -1.352 |
| 3.479999999999822 | -1.354 |
| 3.489999999999822 | -1.355 |
| 3.499999999999822 | -1.357 |
| 3.509999999999822 | -1.359 |
| 3.519999999999821 | -1.361 |
| 3.529999999999821 | -1.363 |
| 3.539999999999821 | -1.364 |
| 3.549999999999821 | -1.366 |
| 3.559999999999821 | -1.368 |
| 3.56999999999982 | -1.37 |
| 3.57999999999982 | -1.372 |
| 3.58999999999982 | -1.373 |
| 3.59999999999982 | -1.375 |
| 3.609999999999819 | -1.377 |
| 3.619999999999819 | -1.379 |
| 3.629999999999819 | -1.38 |
| 3.639999999999819 | -1.382 |
| 3.649999999999819 | -1.384 |
| 3.659999999999818 | -1.386 |
| 3.669999999999818 | -1.387 |
| 3.679999999999818 | -1.389 |
| 3.689999999999818 | -1.391 |
| 3.699999999999818 | -1.392 |
| 3.709999999999817 | -1.394 |
| 3.719999999999817 | -1.396 |
| 3.729999999999817 | -1.398 |
| 3.739999999999817 | -1.399 |
| 3.749999999999817 | -1.401 |
| 3.759999999999816 | -1.403 |
| 3.769999999999816 | -1.404 |
| 3.779999999999816 | -1.406 |
| 3.789999999999816 | -1.408 |
| 3.799999999999815 | -1.409 |
| 3.809999999999815 | -1.411 |
| 3.819999999999815 | -1.413 |
| 3.829999999999815 | -1.414 |
| 3.839999999999815 | -1.416 |
| 3.849999999999814 | -1.418 |
| 3.859999999999814 | -1.419 |
| 3.869999999999814 | -1.421 |
| 3.879999999999814 | -1.423 |
| 3.889999999999814 | -1.424 |
| 3.899999999999813 | -1.426 |
| 3.909999999999813 | -1.428 |
| 3.919999999999813 | -1.429 |
| 3.929999999999813 | -1.431 |
| 3.939999999999813 | -1.433 |
| 3.949999999999812 | -1.434 |
| 3.959999999999812 | -1.436 |
| 3.969999999999812 | -1.437 |
| 3.979999999999812 | -1.439 |
| 3.989999999999811 | -1.441 |
| 3.999999999999811 | -1.442 |
| 4.009999999999811 | -1.444 |
| 4.019999999999811 | -1.445 |
| 4.029999999999811 | -1.447 |
| 4.03999999999981 | -1.449 |
| 4.04999999999981 | -1.45 |
| 4.05999999999981 | -1.452 |
| 4.06999999999981 | -1.453 |
| 4.07999999999981 | -1.455 |
| 4.08999999999981 | -1.457 |
| 4.09999999999981 | -1.458 |
| 4.10999999999981 | -1.46 |
| 4.11999999999981 | -1.461 |
| 4.129999999999809 | -1.463 |
| 4.139999999999808 | -1.464 |
| 4.149999999999808 | -1.466 |
| 4.159999999999808 | -1.467 |
| 4.169999999999808 | -1.469 |
| 4.179999999999807 | -1.471 |
| 4.189999999999807 | -1.472 |
| 4.199999999999807 | -1.474 |
| 4.209999999999807 | -1.475 |
| 4.219999999999807 | -1.477 |
| 4.229999999999806 | -1.478 |
| 4.239999999999806 | -1.48 |
| 4.249999999999806 | -1.481 |
| 4.259999999999806 | -1.483 |
| 4.269999999999805 | -1.484 |
| 4.279999999999805 | -1.486 |
| 4.289999999999805 | -1.487 |
| 4.299999999999805 | -1.489 |
| 4.309999999999805 | -1.49 |
| 4.319999999999804 | -1.492 |
| 4.329999999999804 | -1.493 |
| 4.339999999999804 | -1.495 |
| 4.349999999999804 | -1.496 |
| 4.359999999999804 | -1.498 |
| 4.369999999999804 | -1.499 |
| 4.379999999999803 | -1.501 |
| 4.389999999999803 | -1.502 |
| 4.399999999999803 | -1.504 |
| 4.409999999999802 | -1.505 |
| 4.419999999999802 | -1.507 |
| 4.429999999999802 | -1.508 |
| 4.439999999999802 | -1.51 |
| 4.449999999999802 | -1.511 |
| 4.459999999999801 | -1.512 |
| 4.469999999999801 | -1.514 |
| 4.4799999999998 | -1.515 |
| 4.4899999999998 | -1.517 |
| 4.4999999999998 | -1.518 |
| 4.5099999999998 | -1.52 |
| 4.5199999999998 | -1.521 |
| 4.5299999999998 | -1.523 |
| 4.5399999999998 | -1.524 |
| 4.5499999999998 | -1.525 |
| 4.5599999999998 | -1.527 |
| 4.5699999999998 | -1.528 |
| 4.5799999999998 | -1.53 |
| 4.5899999999998 | -1.531 |
| 4.599999999999799 | -1.533 |
| 4.609999999999799 | -1.534 |
| 4.619999999999798 | -1.535 |
| 4.629999999999798 | -1.537 |
| 4.639999999999798 | -1.538 |
| 4.649999999999798 | -1.54 |
| 4.659999999999798 | -1.541 |
| 4.669999999999797 | -1.542 |
| 4.679999999999797 | -1.544 |
| 4.689999999999797 | -1.545 |
| 4.699999999999797 | -1.547 |
| 4.709999999999796 | -1.548 |
| 4.719999999999796 | -1.549 |
| 4.729999999999796 | -1.551 |
| 4.739999999999795 | -1.552 |
| 4.749999999999795 | -1.554 |
| 4.759999999999795 | -1.555 |
| 4.769999999999795 | -1.556 |
| 4.779999999999795 | -1.558 |
| 4.789999999999794 | -1.559 |
| 4.799999999999794 | -1.56 |
| 4.809999999999794 | -1.562 |
| 4.819999999999794 | -1.563 |
| 4.829999999999794 | -1.565 |
| 4.839999999999794 | -1.566 |
| 4.849999999999794 | -1.567 |
| 4.859999999999793 | -1.569 |
| 4.869999999999793 | -1.57 |
| 4.879999999999793 | -1.571 |
| 4.889999999999793 | -1.573 |
| 4.899999999999792 | -1.574 |
| 4.909999999999792 | -1.575 |
| 4.919999999999792 | -1.577 |
| 4.929999999999792 | -1.578 |
| 4.939999999999791 | -1.579 |
| 4.949999999999791 | -1.581 |
| 4.959999999999791 | -1.582 |
| 4.969999999999791 | -1.583 |
| 4.97999999999979 | -1.585 |
| 4.98999999999979 | -1.586 |
| 4.99999999999979 | -1.587 |
| 5.00999999999979 | -1.589 |
| 5.01999999999979 | -1.59 |
| 5.02999999999979 | -1.591 |
| 5.03999999999979 | -1.593 |
| 5.04999999999979 | -1.594 |
| 5.05999999999979 | -1.595 |
| 5.069999999999789 | -1.597 |
| 5.079999999999788 | -1.598 |
| 5.089999999999788 | -1.599 |
| 5.099999999999788 | -1.601 |
| 5.109999999999788 | -1.602 |
| 5.119999999999788 | -1.603 |
| 5.129999999999788 | -1.604 |
| 5.139999999999787 | -1.606 |
| 5.149999999999787 | -1.607 |
| 5.159999999999787 | -1.608 |
| 5.169999999999787 | -1.61 |
| 5.179999999999786 | -1.611 |
| 5.189999999999786 | -1.612 |
| 5.199999999999786 | -1.613 |
| 5.209999999999785 | -1.615 |
| 5.219999999999785 | -1.616 |
| 5.229999999999785 | -1.617 |
| 5.239999999999785 | -1.619 |
| 5.249999999999785 | -1.62 |
| 5.259999999999784 | -1.621 |
| 5.269999999999784 | -1.622 |
| 5.279999999999784 | -1.624 |
| 5.289999999999784 | -1.625 |
| 5.299999999999784 | -1.626 |
| 5.309999999999784 | -1.627 |
| 5.319999999999784 | -1.629 |
| 5.329999999999783 | -1.63 |
| 5.339999999999783 | -1.631 |
| 5.349999999999783 | -1.632 |
| 5.359999999999783 | -1.634 |
| 5.369999999999782 | -1.635 |
| 5.379999999999782 | -1.636 |
| 5.389999999999782 | -1.637 |
| 5.399999999999782 | -1.639 |
| 5.409999999999781 | -1.64 |
| 5.419999999999781 | -1.641 |
| 5.429999999999781 | -1.642 |
| 5.43999999999978 | -1.644 |
| 5.44999999999978 | -1.645 |
| 5.45999999999978 | -1.646 |
| 5.46999999999978 | -1.647 |
| 5.47999999999978 | -1.649 |
| 5.48999999999978 | -1.65 |
| 5.49999999999978 | -1.651 |
| 5.50999999999978 | -1.652 |
| 5.51999999999978 | -1.653 |
| 5.52999999999978 | -1.655 |
| 5.539999999999778 | -1.656 |
| 5.549999999999778 | -1.657 |
| 5.559999999999778 | -1.658 |
| 5.569999999999778 | -1.659 |
| 5.579999999999778 | -1.661 |
| 5.589999999999777 | -1.662 |
| 5.599999999999777 | -1.663 |
| 5.609999999999777 | -1.664 |
| 5.619999999999777 | -1.666 |
| 5.629999999999777 | -1.667 |
| 5.639999999999776 | -1.668 |
| 5.649999999999776 | -1.669 |
| 5.659999999999776 | -1.67 |
| 5.669999999999776 | -1.671 |
| 5.679999999999775 | -1.673 |
| 5.689999999999775 | -1.674 |
| 5.699999999999775 | -1.675 |
| 5.709999999999775 | -1.676 |
| 5.719999999999774 | -1.677 |
| 5.729999999999774 | -1.679 |
| 5.739999999999774 | -1.68 |
| 5.749999999999774 | -1.681 |
| 5.759999999999774 | -1.682 |
| 5.769999999999774 | -1.683 |
| 5.779999999999773 | -1.685 |
| 5.789999999999773 | -1.686 |
| 5.799999999999773 | -1.687 |
| 5.809999999999773 | -1.688 |
| 5.819999999999773 | -1.689 |
| 5.829999999999773 | -1.69 |
| 5.839999999999772 | -1.692 |
| 5.849999999999772 | -1.693 |
| 5.859999999999772 | -1.694 |
| 5.869999999999772 | -1.695 |
| 5.879999999999771 | -1.696 |
| 5.889999999999771 | -1.697 |
| 5.899999999999771 | -1.698 |
| 5.90999999999977 | -1.7 |
| 5.91999999999977 | -1.701 |
| 5.92999999999977 | -1.702 |
| 5.93999999999977 | -1.703 |
| 5.94999999999977 | -1.704 |
| 5.95999999999977 | -1.705 |
| 5.96999999999977 | -1.707 |
| 5.97999999999977 | -1.708 |
| 5.98999999999977 | -1.709 |
| 5.99999999999977 | -1.71 |
| 6.009999999999768 | -1.711 |
| 6.019999999999768 | -1.712 |
| 6.029999999999768 | -1.713 |
| 6.039999999999768 | -1.715 |
| 6.049999999999767 | -1.716 |
| 6.059999999999767 | -1.717 |
| 6.069999999999767 | -1.718 |
| 6.079999999999767 | -1.719 |
| 6.089999999999767 | -1.72 |
| 6.099999999999766 | -1.721 |
| 6.109999999999766 | -1.722 |
| 6.119999999999766 | -1.724 |
| 6.129999999999766 | -1.725 |
| 6.139999999999766 | -1.726 |
| 6.149999999999765 | -1.727 |
| 6.159999999999765 | -1.728 |
| 6.169999999999765 | -1.729 |
| 6.179999999999765 | -1.73 |
| 6.189999999999764 | -1.731 |
| 6.199999999999764 | -1.732 |
| 6.209999999999764 | -1.734 |
| 6.219999999999764 | -1.735 |
| 6.229999999999764 | -1.736 |
| 6.239999999999763 | -1.737 |
| 6.249999999999763 | -1.738 |
| 6.259999999999763 | -1.739 |
| 6.269999999999763 | -1.74 |
| 6.279999999999763 | -1.741 |
| 6.289999999999762 | -1.742 |
| 6.299999999999762 | -1.744 |
| 6.309999999999762 | -1.745 |
| 6.319999999999762 | -1.746 |
| 6.329999999999762 | -1.747 |
| 6.339999999999761 | -1.748 |
| 6.349999999999761 | -1.749 |
| 6.359999999999761 | -1.75 |
| 6.369999999999761 | -1.751 |
| 6.37999999999976 | -1.752 |
| 6.38999999999976 | -1.753 |
| 6.39999999999976 | -1.754 |
| 6.40999999999976 | -1.755 |
| 6.41999999999976 | -1.757 |
| 6.42999999999976 | -1.758 |
| 6.43999999999976 | -1.759 |
| 6.44999999999976 | -1.76 |
| 6.45999999999976 | -1.761 |
| 6.46999999999976 | -1.762 |
| 6.479999999999758 | -1.763 |
| 6.489999999999758 | -1.764 |
| 6.499999999999758 | -1.765 |
| 6.509999999999758 | -1.766 |
| 6.519999999999758 | -1.767 |
| 6.529999999999758 | -1.768 |
| 6.539999999999757 | -1.769 |
| 6.549999999999757 | -1.771 |
| 6.559999999999757 | -1.772 |
| 6.569999999999757 | -1.773 |
| 6.579999999999756 | -1.774 |
| 6.589999999999756 | -1.775 |
| 6.599999999999756 | -1.776 |
| 6.609999999999756 | -1.777 |
| 6.619999999999756 | -1.778 |
| 6.629999999999756 | -1.779 |
| 6.639999999999755 | -1.78 |
| 6.649999999999755 | -1.781 |
| 6.659999999999755 | -1.782 |
| 6.669999999999755 | -1.783 |
| 6.679999999999754 | -1.784 |
| 6.689999999999754 | -1.785 |
| 6.699999999999754 | -1.786 |
| 6.709999999999754 | -1.787 |
| 6.719999999999754 | -1.788 |
| 6.729999999999753 | -1.789 |
| 6.739999999999753 | -1.79 |
| 6.749999999999753 | -1.792 |
| 6.759999999999753 | -1.793 |
| 6.769999999999753 | -1.794 |
| 6.779999999999752 | -1.795 |
| 6.789999999999752 | -1.796 |
| 6.799999999999752 | -1.797 |
| 6.809999999999752 | -1.798 |
| 6.819999999999752 | -1.799 |
| 6.829999999999751 | -1.8 |
| 6.839999999999751 | -1.801 |
| 6.849999999999751 | -1.802 |
| 6.859999999999751 | -1.803 |
| 6.86999999999975 | -1.804 |
| 6.87999999999975 | -1.805 |
| 6.88999999999975 | -1.806 |
| 6.89999999999975 | -1.807 |
| 6.90999999999975 | -1.808 |
| 6.91999999999975 | -1.809 |
| 6.92999999999975 | -1.81 |
| 6.93999999999975 | -1.811 |
| 6.949999999999748 | -1.812 |
| 6.959999999999748 | -1.813 |
| 6.969999999999748 | -1.814 |
| 6.979999999999748 | -1.815 |
| 6.989999999999747 | -1.816 |
| 6.999999999999747 | -1.817 |
| 7.009999999999747 | -1.818 |
| 7.019999999999747 | -1.819 |
| 7.029999999999747 | -1.82 |
| 7.039999999999746 | -1.821 |
| 7.049999999999746 | -1.822 |
| 7.059999999999746 | -1.823 |
| 7.069999999999746 | -1.824 |
| 7.079999999999746 | -1.825 |
| 7.089999999999745 | -1.826 |
| 7.099999999999745 | -1.827 |
| 7.109999999999745 | -1.828 |
| 7.119999999999745 | -1.829 |
| 7.129999999999745 | -1.83 |
| 7.139999999999744 | -1.831 |
| 7.149999999999744 | -1.832 |
| 7.159999999999744 | -1.833 |
| 7.169999999999744 | -1.834 |
| 7.179999999999744 | -1.835 |
| 7.189999999999744 | -1.836 |
| 7.199999999999743 | -1.837 |
| 7.209999999999743 | -1.838 |
| 7.219999999999743 | -1.839 |
| 7.229999999999743 | -1.84 |
| 7.239999999999742 | -1.841 |
| 7.249999999999742 | -1.842 |
| 7.259999999999742 | -1.843 |
| 7.269999999999742 | -1.844 |
| 7.279999999999741 | -1.845 |
| 7.289999999999741 | -1.846 |
| 7.299999999999741 | -1.847 |
| 7.309999999999741 | -1.848 |
| 7.319999999999741 | -1.849 |
| 7.329999999999741 | -1.85 |
| 7.33999999999974 | -1.851 |
| 7.34999999999974 | -1.852 |
| 7.35999999999974 | -1.853 |
| 7.36999999999974 | -1.854 |
| 7.37999999999974 | -1.855 |
| 7.38999999999974 | -1.856 |
| 7.39999999999974 | -1.857 |
| 7.409999999999738 | -1.858 |
| 7.419999999999738 | -1.859 |
| 7.429999999999738 | -1.86 |
| 7.439999999999738 | -1.86 |
| 7.449999999999738 | -1.861 |
| 7.459999999999737 | -1.862 |
| 7.469999999999737 | -1.863 |
| 7.479999999999737 | -1.864 |
| 7.489999999999737 | -1.865 |
| 7.499999999999737 | -1.866 |
| 7.509999999999736 | -1.867 |
| 7.519999999999736 | -1.868 |
| 7.529999999999736 | -1.869 |
| 7.539999999999736 | -1.87 |
| 7.549999999999736 | -1.871 |
| 7.559999999999735 | -1.872 |
| 7.569999999999735 | -1.873 |
| 7.579999999999735 | -1.874 |
| 7.589999999999735 | -1.875 |
| 7.599999999999734 | -1.876 |
| 7.609999999999734 | -1.877 |
| 7.619999999999734 | -1.878 |
| 7.629999999999734 | -1.879 |
| 7.639999999999734 | -1.88 |
| 7.649999999999734 | -1.881 |
| 7.659999999999734 | -1.881 |
| 7.669999999999733 | -1.882 |
| 7.679999999999733 | -1.883 |
| 7.689999999999733 | -1.884 |
| 7.699999999999733 | -1.885 |
| 7.709999999999732 | -1.886 |
| 7.719999999999732 | -1.887 |
| 7.729999999999732 | -1.888 |
| 7.739999999999731 | -1.889 |
| 7.749999999999731 | -1.89 |
| 7.759999999999731 | -1.891 |
| 7.769999999999731 | -1.892 |
| 7.77999999999973 | -1.893 |
| 7.78999999999973 | -1.894 |
| 7.79999999999973 | -1.895 |
| 7.80999999999973 | -1.895 |
| 7.81999999999973 | -1.896 |
| 7.82999999999973 | -1.897 |
| 7.83999999999973 | -1.898 |
| 7.84999999999973 | -1.899 |
| 7.85999999999973 | -1.9 |
| 7.86999999999973 | -1.901 |
| 7.879999999999728 | -1.902 |
| 7.889999999999728 | -1.903 |
| 7.899999999999728 | -1.904 |
| 7.909999999999728 | -1.905 |
| 7.919999999999728 | -1.906 |
| 7.929999999999727 | -1.907 |
| 7.939999999999727 | -1.907 |
| 7.949999999999727 | -1.908 |
| 7.959999999999727 | -1.909 |
| 7.969999999999727 | -1.91 |
| 7.979999999999726 | -1.911 |
| 7.989999999999726 | -1.912 |
| 7.999999999999726 | -1.913 |
| 8.009999999999726 | -1.914 |
| 8.019999999999726 | -1.915 |
| 8.029999999999726 | -1.916 |
| 8.039999999999726 | -1.917 |
| 8.049999999999725 | -1.917 |
| 8.059999999999725 | -1.918 |
| 8.069999999999723 | -1.919 |
| 8.079999999999725 | -1.92 |
| 8.089999999999725 | -1.921 |
| 8.099999999999724 | -1.922 |
| 8.109999999999724 | -1.923 |
| 8.119999999999724 | -1.924 |
| 8.129999999999724 | -1.925 |
| 8.139999999999723 | -1.926 |
| 8.149999999999723 | -1.926 |
| 8.159999999999723 | -1.927 |
| 8.169999999999723 | -1.928 |
| 8.179999999999723 | -1.929 |
| 8.189999999999722 | -1.93 |
| 8.199999999999722 | -1.931 |
| 8.20999999999972 | -1.932 |
| 8.219999999999722 | -1.933 |
| 8.229999999999722 | -1.934 |
| 8.239999999999721 | -1.935 |
| 8.249999999999721 | -1.935 |
| 8.25999999999972 | -1.936 |
| 8.26999999999972 | -1.937 |
| 8.27999999999972 | -1.938 |
| 8.28999999999972 | -1.939 |
| 8.29999999999972 | -1.94 |
| 8.30999999999972 | -1.941 |
| 8.31999999999972 | -1.942 |
| 8.32999999999972 | -1.943 |
| 8.33999999999972 | -1.943 |
| 8.349999999999717 | -1.944 |
| 8.359999999999719 | -1.945 |
| 8.369999999999719 | -1.946 |
| 8.379999999999718 | -1.947 |
| 8.389999999999718 | -1.948 |
| 8.399999999999716 | -1.949 |
| 8.409999999999718 | -1.95 |
| 8.419999999999717 | -1.95 |
| 8.429999999999717 | -1.951 |
| 8.439999999999717 | -1.952 |
| 8.449999999999717 | -1.953 |
| 8.459999999999717 | -1.954 |
| 8.469999999999716 | -1.955 |
| 8.479999999999716 | -1.956 |
| 8.489999999999714 | -1.957 |
| 8.499999999999716 | -1.957 |
| 8.509999999999716 | -1.958 |
| 8.519999999999715 | -1.959 |
| 8.529999999999715 | -1.96 |
| 8.539999999999713 | -1.961 |
| 8.549999999999715 | -1.962 |
| 8.559999999999715 | -1.963 |
| 8.569999999999714 | -1.964 |
| 8.579999999999714 | -1.964 |
| 8.589999999999714 | -1.965 |
| 8.599999999999714 | -1.966 |
| 8.609999999999713 | -1.967 |
| 8.619999999999713 | -1.968 |
| 8.629999999999711 | -1.969 |
| 8.639999999999713 | -1.97 |
| 8.649999999999713 | -1.97 |
| 8.65999999999971 | -1.971 |
| 8.66999999999971 | -1.972 |
| 8.67999999999971 | -1.973 |
| 8.68999999999971 | -1.974 |
| 8.69999999999971 | -1.975 |
| 8.70999999999971 | -1.976 |
| 8.71999999999971 | -1.976 |
| 8.72999999999971 | -1.977 |
| 8.73999999999971 | -1.978 |
| 8.74999999999971 | -1.979 |
| 8.75999999999971 | -1.98 |
| 8.76999999999971 | -1.981 |
| 8.77999999999971 | -1.981 |
| 8.78999999999971 | -1.982 |
| 8.79999999999971 | -1.983 |
| 8.80999999999971 | -1.984 |
| 8.819999999999707 | -1.985 |
| 8.829999999999709 | -1.986 |
| 8.839999999999709 | -1.987 |
| 8.849999999999708 | -1.987 |
| 8.859999999999708 | -1.988 |
| 8.869999999999706 | -1.989 |
| 8.879999999999708 | -1.99 |
| 8.889999999999707 | -1.991 |
| 8.899999999999707 | -1.992 |
| 8.909999999999707 | -1.992 |
| 8.919999999999707 | -1.993 |
| 8.929999999999707 | -1.994 |
| 8.939999999999706 | -1.995 |
| 8.949999999999706 | -1.996 |
| 8.959999999999704 | -1.997 |
| 8.969999999999706 | -1.997 |
| 8.979999999999706 | -1.998 |
| 8.989999999999705 | -1.999 |
| 8.999999999999705 | -2 |
| 9.009999999999703 | -2.001 |
| 9.019999999999705 | -2.002 |
| 9.029999999999704 | -2.002 |
| 9.039999999999704 | -2.003 |
| 9.049999999999704 | -2.004 |
| 9.059999999999704 | -2.005 |
| 9.069999999999704 | -2.006 |
| 9.079999999999703 | -2.007 |
| 9.089999999999703 | -2.007 |
| 9.099999999999701 | -2.008 |
| 9.109999999999703 | -2.009 |
| 9.119999999999703 | -2.01 |
| 9.129999999999702 | -2.011 |
| 9.139999999999702 | -2.012 |
| 9.1499999999997 | -2.012 |
| 9.1599999999997 | -2.013 |
| 9.1699999999997 | -2.014 |
| 9.1799999999997 | -2.015 |
| 9.1899999999997 | -2.016 |
| 9.1999999999997 | -2.017 |
| 9.2099999999997 | -2.017 |
| 9.2199999999997 | -2.018 |
| 9.2299999999997 | -2.019 |
| 9.2399999999997 | -2.02 |
| 9.2499999999997 | -2.021 |
| 9.2599999999997 | -2.021 |
| 9.2699999999997 | -2.022 |
| 9.2799999999997 | -2.023 |
| 9.289999999999697 | -2.024 |
| 9.299999999999699 | -2.025 |
| 9.309999999999699 | -2.026 |
| 9.319999999999698 | -2.026 |
| 9.329999999999698 | -2.027 |
| 9.339999999999698 | -2.028 |
| 9.349999999999698 | -2.029 |
| 9.359999999999697 | -2.03 |
| 9.369999999999697 | -2.03 |
| 9.379999999999695 | -2.031 |
| 9.389999999999697 | -2.032 |
| 9.399999999999697 | -2.033 |
| 9.409999999999696 | -2.034 |
| 9.419999999999696 | -2.034 |
| 9.429999999999694 | -2.035 |
| 9.439999999999696 | -2.036 |
| 9.449999999999696 | -2.037 |
| 9.459999999999695 | -2.038 |
| 9.469999999999695 | -2.038 |
| 9.479999999999693 | -2.039 |
| 9.489999999999695 | -2.04 |
| 9.499999999999694 | -2.041 |
| 9.509999999999694 | -2.042 |
| 9.519999999999694 | -2.042 |
| 9.529999999999694 | -2.043 |
| 9.539999999999694 | -2.044 |
| 9.549999999999693 | -2.045 |
| 9.55999999999969 | -2.046 |
| 9.56999999999969 | -2.046 |
| 9.57999999999969 | -2.047 |
| 9.58999999999969 | -2.048 |
| 9.59999999999969 | -2.049 |
| 9.60999999999969 | -2.05 |
| 9.61999999999969 | -2.05 |
| 9.62999999999969 | -2.051 |
| 9.63999999999969 | -2.052 |
| 9.64999999999969 | -2.053 |
| 9.65999999999969 | -2.054 |
| 9.66999999999969 | -2.054 |
| 9.67999999999969 | -2.055 |
| 9.68999999999969 | -2.056 |
| 9.69999999999969 | -2.057 |
| 9.70999999999969 | -2.057 |
| 9.71999999999969 | -2.058 |
| 9.72999999999969 | -2.059 |
| 9.73999999999969 | -2.06 |
| 9.74999999999969 | -2.061 |
| 9.759999999999687 | -2.061 |
| 9.769999999999689 | -2.062 |
| 9.779999999999688 | -2.063 |
| 9.789999999999688 | -2.064 |
| 9.799999999999686 | -2.065 |
| 9.809999999999688 | -2.065 |
| 9.819999999999688 | -2.066 |
| 9.829999999999687 | -2.067 |
| 9.839999999999687 | -2.068 |
| 9.849999999999685 | -2.068 |
| 9.859999999999687 | -2.069 |
| 9.869999999999687 | -2.07 |
| 9.879999999999686 | -2.071 |
| 9.889999999999686 | -2.072 |
| 9.899999999999684 | -2.072 |
| 9.909999999999686 | -2.073 |
| 9.919999999999686 | -2.074 |
| 9.929999999999685 | -2.075 |
| 9.939999999999685 | -2.075 |
| 9.949999999999685 | -2.076 |
| 9.959999999999685 | -2.077 |
| 9.969999999999684 | -2.078 |
| 9.979999999999684 | -2.079 |
| 9.989999999999682 | -2.079 |
| 9.999999999999684 | -2.08 |
| 10.00999999999968 | -2.081 |
| 10.01999999999968 | -2.082 |
| 10.02999999999968 | -2.082 |
| 10.03999999999968 | -2.083 |
| 10.04999999999968 | -2.084 |
| 10.05999999999968 | -2.085 |
| 10.06999999999968 | -2.085 |
| 10.07999999999968 | -2.086 |
| 10.08999999999968 | -2.087 |
| 10.09999999999968 | -2.088 |
| 10.10999999999968 | -2.089 |
| 10.11999999999968 | -2.089 |
| 10.12999999999968 | -2.09 |
| 10.13999999999968 | -2.091 |
| 10.14999999999968 | -2.092 |
| 10.15999999999968 | -2.092 |
| 10.16999999999968 | -2.093 |
| 10.17999999999968 | -2.094 |
| 10.18999999999968 | -2.095 |
| 10.19999999999968 | -2.095 |
| 10.20999999999968 | -2.096 |
| 10.21999999999968 | -2.097 |
| 10.22999999999968 | -2.098 |
| 10.23999999999968 | -2.098 |
| 10.24999999999968 | -2.099 |
| 10.25999999999968 | -2.1 |
| 10.26999999999968 | -2.101 |
| 10.27999999999968 | -2.101 |
| 10.28999999999968 | -2.102 |
| 10.29999999999968 | -2.103 |
| 10.30999999999968 | -2.104 |
| 10.31999999999968 | -2.104 |
| 10.32999999999968 | -2.105 |
| 10.33999999999968 | -2.106 |
| 10.34999999999968 | -2.107 |
| 10.35999999999968 | -2.107 |
| 10.36999999999968 | -2.108 |
| 10.37999999999968 | -2.109 |
| 10.38999999999968 | -2.11 |
| 10.39999999999968 | -2.11 |
| 10.40999999999968 | -2.111 |
| 10.41999999999967 | -2.112 |
| 10.42999999999967 | -2.113 |
| 10.43999999999967 | -2.113 |
| 10.44999999999967 | -2.114 |
| 10.45999999999967 | -2.115 |
| 10.46999999999967 | -2.116 |
| 10.47999999999967 | -2.116 |
| 10.48999999999967 | -2.117 |
| 10.49999999999967 | -2.118 |
| 10.50999999999967 | -2.119 |
| 10.51999999999967 | -2.119 |
| 10.52999999999967 | -2.12 |
| 10.53999999999967 | -2.121 |
| 10.54999999999967 | -2.122 |
| 10.55999999999967 | -2.122 |
| 10.56999999999967 | -2.123 |
| 10.57999999999967 | -2.124 |
| 10.58999999999967 | -2.125 |
| 10.59999999999967 | -2.125 |
| 10.60999999999967 | -2.126 |
| 10.61999999999967 | -2.127 |
| 10.62999999999967 | -2.128 |
| 10.63999999999967 | -2.128 |
| 10.64999999999967 | -2.129 |
| 10.65999999999967 | -2.13 |
| 10.66999999999967 | -2.13 |
| 10.67999999999967 | -2.131 |
| 10.68999999999967 | -2.132 |
| 10.69999999999967 | -2.133 |
| 10.70999999999967 | -2.133 |
| 10.71999999999967 | -2.134 |
| 10.72999999999967 | -2.135 |
| 10.73999999999967 | -2.136 |
| 10.74999999999967 | -2.136 |
| 10.75999999999967 | -2.137 |
| 10.76999999999967 | -2.138 |
| 10.77999999999967 | -2.139 |
| 10.78999999999967 | -2.139 |
| 10.79999999999967 | -2.14 |
| 10.80999999999967 | -2.141 |
| 10.81999999999967 | -2.141 |
| 10.82999999999967 | -2.142 |
| 10.83999999999967 | -2.143 |
| 10.84999999999967 | -2.144 |
| 10.85999999999967 | -2.144 |
| 10.86999999999967 | -2.145 |
| 10.87999999999966 | -2.146 |
| 10.88999999999966 | -2.147 |
| 10.89999999999966 | -2.147 |
| 10.90999999999966 | -2.148 |
| 10.91999999999966 | -2.149 |
| 10.92999999999966 | -2.149 |
| 10.93999999999966 | -2.15 |
| 10.94999999999966 | -2.151 |
| 10.95999999999966 | -2.152 |
| 10.96999999999966 | -2.152 |
| 10.97999999999966 | -2.153 |
| 10.98999999999966 | -2.154 |
| 10.99999999999966 | -2.154 |